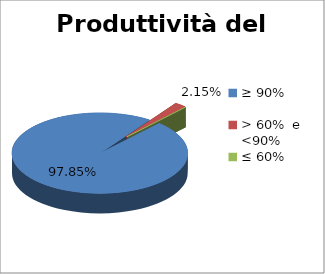
| Category | Produttività del personale |
|---|---|
| ≥ 90% | 0.978 |
| > 60%  e  <90% | 0.022 |
| ≤ 60% | 0 |